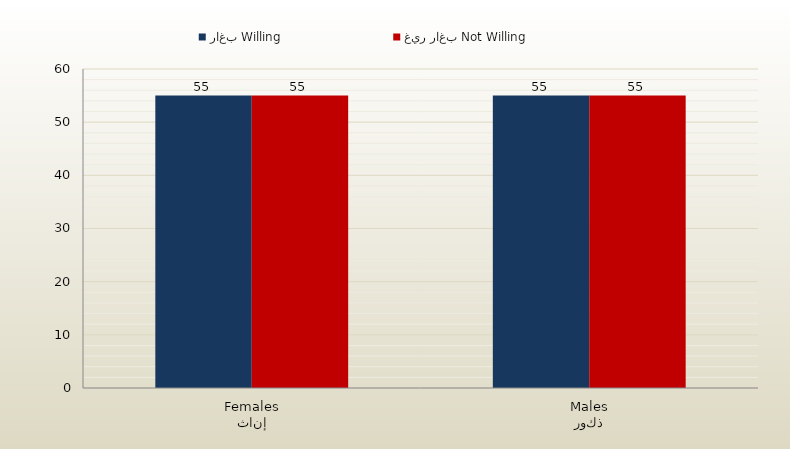
| Category | راغب Willing | غير راغب Not Willing |
|---|---|---|
| إناث
Females | 55 | 55 |
| ذكور
Males | 55 | 55 |